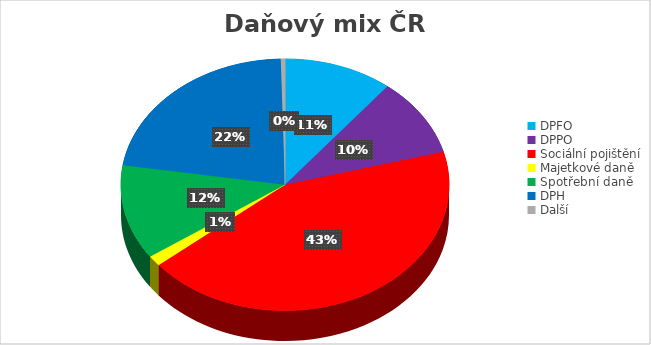
| Category | Series 0 |
|---|---|
| DPFO | 149831 |
| DPPO | 140432 |
| Sociální pojištění | 603072 |
| Majetkové daně | 19210 |
| Spotřební daně | 169564 |
| DPH | 308822 |
| Další | 5752 |